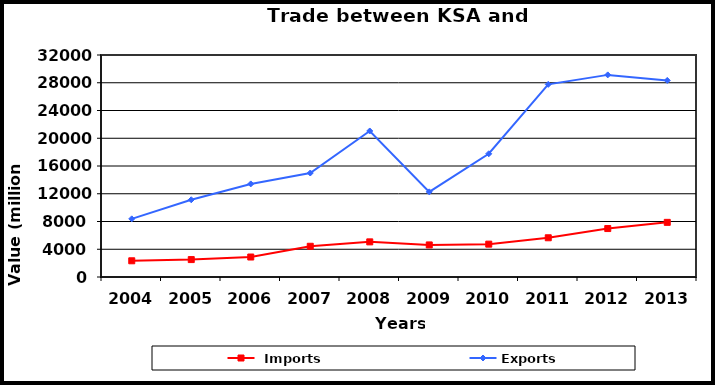
| Category |  Imports | Exports |
|---|---|---|
| 2004.0 | 2336 | 8382 |
| 2005.0 | 2510 | 11134 |
| 2006.0 | 2880 | 13417 |
| 2007.0 | 4429 | 14990 |
| 2008.0 | 5064 | 21049 |
| 2009.0 | 4623 | 12274 |
| 2010.0 | 4735 | 17763 |
| 2011.0 | 5655 | 27770 |
| 2012.0 | 6984 | 29134 |
| 2013.0 | 7877 | 28334 |